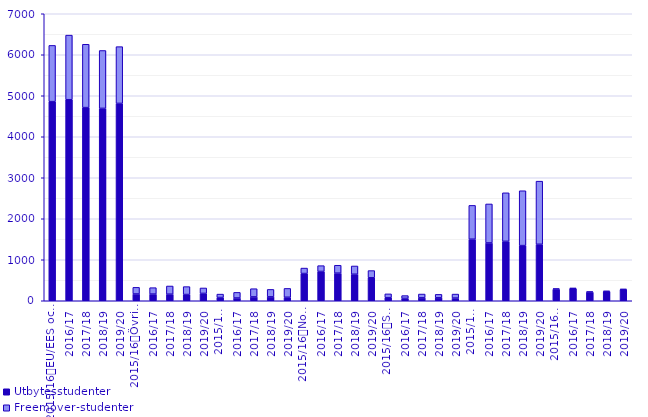
| Category | Utbytesstudenter | Freemover-studenter |
|---|---|---|
| 0 | 4856 | 1372 |
| 1 | 4903 | 1576 |
| 2 | 4711 | 1545 |
| 3 | 4692 | 1412 |
| 4 | 4813 | 1385 |
| 5 | 165 | 162 |
| 6 | 162 | 157 |
| 7 | 160 | 200 |
| 8 | 152 | 193 |
| 9 | 179 | 133 |
| 10 | 79 | 83 |
| 11 | 67 | 137 |
| 12 | 94 | 200 |
| 13 | 95 | 182 |
| 14 | 85 | 216 |
| 15 | 664 | 133 |
| 16 | 714 | 142 |
| 17 | 673 | 193 |
| 18 | 647 | 201 |
| 19 | 561 | 175 |
| 20 | 75 | 93 |
| 21 | 57 | 69 |
| 22 | 71 | 93 |
| 23 | 72 | 84 |
| 24 | 65 | 98 |
| 25 | 1501 | 825 |
| 26 | 1410 | 951 |
| 27 | 1449 | 1184 |
| 28 | 1345 | 1338 |
| 29 | 1377 | 1540 |
| 30 | 282 | 14 |
| 31 | 295 | 16 |
| 32 | 211 | 10 |
| 33 | 224 | 16 |
| 34 | 272 | 15 |